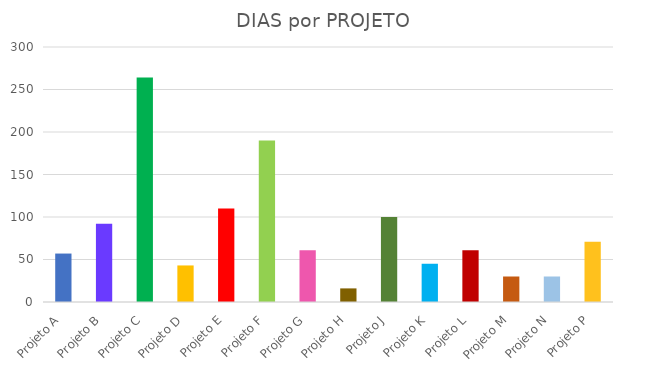
| Category | N.º de DIAS |
|---|---|
| Projeto A | 57 |
| Projeto B | 92 |
| Projeto C | 264 |
| Projeto D | 43 |
| Projeto E | 110 |
| Projeto F | 190 |
| Projeto G | 61 |
| Projeto H | 16 |
| Projeto J | 100 |
| Projeto K | 45 |
| Projeto L | 61 |
| Projeto M | 30 |
| Projeto N | 30 |
| Projeto P | 71 |